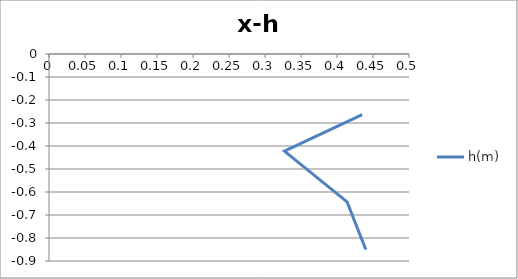
| Category | h(m) |
|---|---|
| 0.435 | -0.264 |
| 0.327 | -0.422 |
| 0.414 | -0.643 |
| 0.44 | -0.85 |